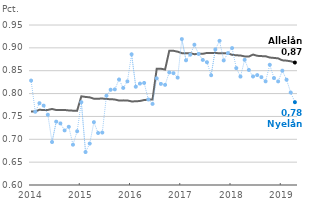
| Category | Alle lån | Nye lån |
|---|---|---|
| 2014-01-01 | 0.761 | 0.828 |
| 2014-02-01 | 0.761 | 0.76 |
| 2014-03-01 | 0.765 | 0.779 |
| 2014-04-01 | 0.764 | 0.774 |
| 2014-05-01 | 0.764 | 0.754 |
| 2014-06-01 | 0.766 | 0.694 |
| 2014-07-01 | 0.764 | 0.739 |
| 2014-08-01 | 0.764 | 0.735 |
| 2014-09-01 | 0.764 | 0.719 |
| 2014-10-01 | 0.763 | 0.727 |
| 2014-11-01 | 0.763 | 0.688 |
| 2014-12-01 | 0.763 | 0.718 |
| 2015-01-01 | 0.794 | 0.781 |
| 2015-02-01 | 0.793 | 0.672 |
| 2015-03-01 | 0.792 | 0.691 |
| 2015-04-01 | 0.789 | 0.738 |
| 2015-05-01 | 0.789 | 0.714 |
| 2015-06-01 | 0.789 | 0.715 |
| 2015-07-01 | 0.788 | 0.795 |
| 2015-08-01 | 0.788 | 0.808 |
| 2015-09-01 | 0.787 | 0.809 |
| 2015-10-01 | 0.785 | 0.831 |
| 2015-11-01 | 0.785 | 0.812 |
| 2015-12-01 | 0.785 | 0.827 |
| 2016-01-01 | 0.783 | 0.886 |
| 2016-02-01 | 0.783 | 0.815 |
| 2016-03-01 | 0.784 | 0.822 |
| 2016-04-01 | 0.786 | 0.823 |
| 2016-05-01 | 0.787 | 0.787 |
| 2016-06-01 | 0.787 | 0.777 |
| 2016-07-01 | 0.854 | 0.833 |
| 2016-08-01 | 0.854 | 0.821 |
| 2016-09-01 | 0.853 | 0.819 |
| 2016-10-01 | 0.894 | 0.846 |
| 2016-11-01 | 0.894 | 0.845 |
| 2016-12-01 | 0.892 | 0.835 |
| 2017-01-01 | 0.888 | 0.919 |
| 2017-02-01 | 0.888 | 0.873 |
| 2017-03-01 | 0.888 | 0.885 |
| 2017-04-01 | 0.886 | 0.907 |
| 2017-05-01 | 0.887 | 0.887 |
| 2017-06-01 | 0.887 | 0.874 |
| 2017-07-01 | 0.889 | 0.869 |
| 2017-08-01 | 0.889 | 0.84 |
| 2017-09-01 | 0.889 | 0.897 |
| 2017-10-01 | 0.888 | 0.915 |
| 2017-11-01 | 0.888 | 0.873 |
| 2017-12-01 | 0.888 | 0.889 |
| 2018-01-01 | 0.885 | 0.899 |
| 2018-02-01 | 0.884 | 0.856 |
| 2018-03-01 | 0.883 | 0.837 |
| 2018-04-01 | 0.881 | 0.874 |
| 2018-05-01 | 0.881 | 0.852 |
| 2018-06-01 | 0.885 | 0.837 |
| 2018-07-01 | 0.883 | 0.84 |
| 2018-08-01 | 0.882 | 0.836 |
| 2018-09-01 | 0.882 | 0.827 |
| 2018-10-01 | 0.879 | 0.863 |
| 2018-11-01 | 0.878 | 0.834 |
| 2018-12-01 | 0.877 | 0.827 |
| 2019-01-01 | 0.873 | 0.85 |
| 2019-02-01 | 0.872 | 0.83 |
| 2019-03-01 | 0.871 | 0.802 |
| 2019-04-01 | 0.868 | 0.781 |